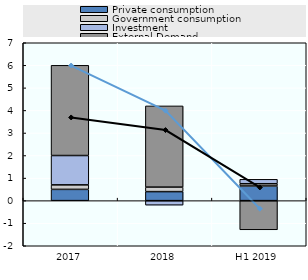
| Category | Private consumption | Government consumption | Investment | External Demand |
|---|---|---|---|---|
| 2017 | 0.5 | 0.2 | 1.3 | 4 |
| 2018 | 0.4 | 0.2 | -0.2 | 3.6 |
| H1 2019 | 0.65 | 0.1 | 0.195 | -1.292 |